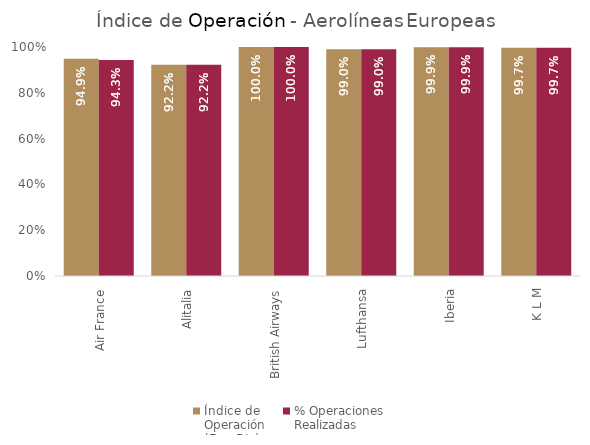
| Category | Índice de 
Operación
(Ene-Dic) | % Operaciones
Realizadas |
|---|---|---|
| Air France | 0.949 | 0.943 |
| Alitalia | 0.922 | 0.922 |
| British Airways | 1 | 1 |
| Lufthansa | 0.99 | 0.99 |
| Iberia | 0.999 | 0.999 |
| K L M | 0.997 | 0.997 |